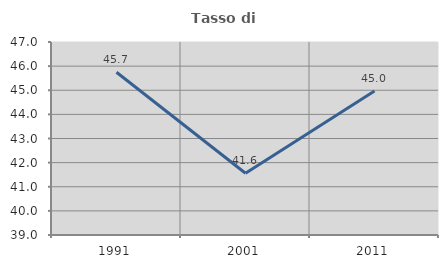
| Category | Tasso di occupazione   |
|---|---|
| 1991.0 | 45.745 |
| 2001.0 | 41.562 |
| 2011.0 | 44.972 |